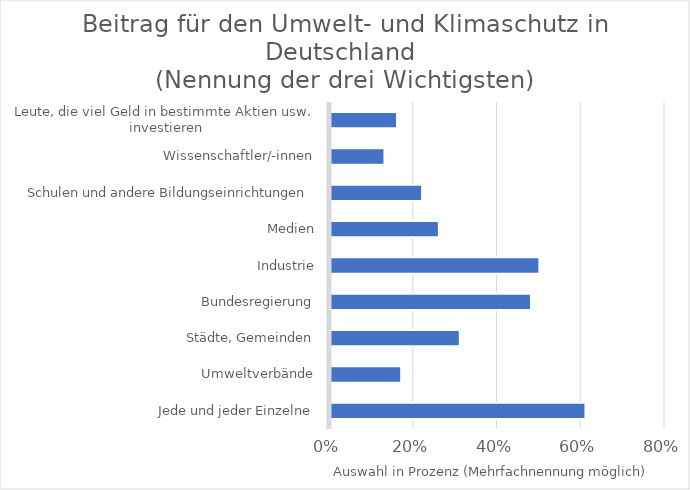
| Category | Series 0 |
|---|---|
| Jede und jeder Einzelne | 0.61 |
| Umweltverbände | 0.17 |
| Städte, Gemeinden | 0.31 |
| Bundesregierung | 0.48 |
| Industrie | 0.5 |
| Medien | 0.26 |
| Schulen und andere Bildungseinrichtungen | 0.22 |
| Wissenschaftler/-innen | 0.13 |
| Leute, die viel Geld in bestimmte Aktien usw. investieren | 0.16 |